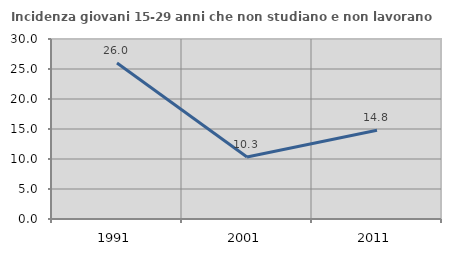
| Category | Incidenza giovani 15-29 anni che non studiano e non lavorano  |
|---|---|
| 1991.0 | 26.001 |
| 2001.0 | 10.327 |
| 2011.0 | 14.78 |